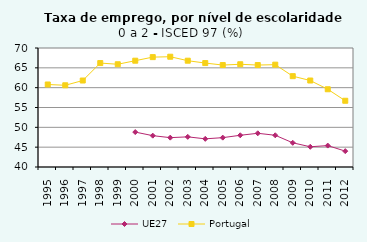
| Category | UE27 | Portugal |
|---|---|---|
| 1995.0 | 0 | 60.8 |
| 1996.0 | 0 | 60.6 |
| 1997.0 | 0 | 61.8 |
| 1998.0 | 0 | 66.2 |
| 1999.0 | 0 | 65.9 |
| 2000.0 | 48.8 | 66.8 |
| 2001.0 | 47.9 | 67.7 |
| 2002.0 | 47.4 | 67.8 |
| 2003.0 | 47.6 | 66.8 |
| 2004.0 | 47.1 | 66.2 |
| 2005.0 | 47.4 | 65.7 |
| 2006.0 | 48 | 65.9 |
| 2007.0 | 48.5 | 65.7 |
| 2008.0 | 48 | 65.8 |
| 2009.0 | 46.1 | 62.9 |
| 2010.0 | 45.1 | 61.8 |
| 2011.0 | 45.4 | 59.6 |
| 2012.0 | 44 | 56.7 |